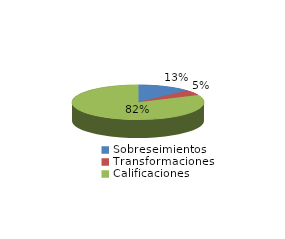
| Category | Series 0 |
|---|---|
| Sobreseimientos | 287 |
| Transformaciones | 108 |
| Calificaciones | 1784 |